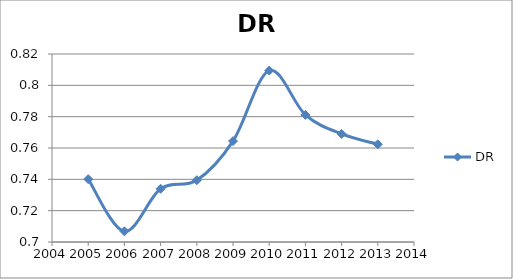
| Category | DR |
|---|---|
| 2005.0 | 0.74 |
| 2006.0 | 0.707 |
| 2007.0 | 0.734 |
| 2008.0 | 0.739 |
| 2009.0 | 0.764 |
| 2010.0 | 0.809 |
| 2011.0 | 0.781 |
| 2012.0 | 0.769 |
| 2013.0 | 0.762 |